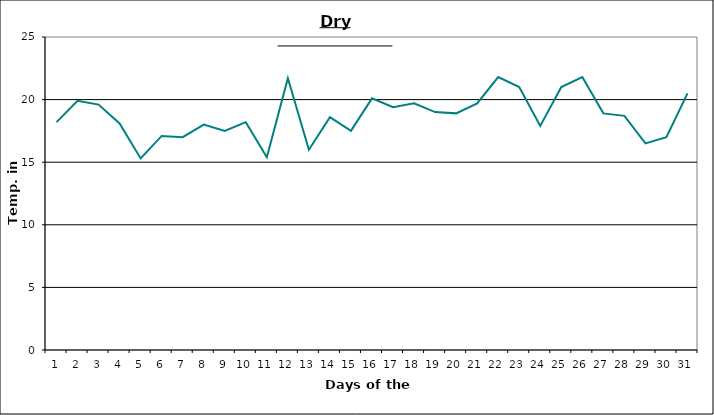
| Category | Series 0 |
|---|---|
| 0 | 18.2 |
| 1 | 19.9 |
| 2 | 19.6 |
| 3 | 18.1 |
| 4 | 15.3 |
| 5 | 17.1 |
| 6 | 17 |
| 7 | 18 |
| 8 | 17.5 |
| 9 | 18.2 |
| 10 | 15.4 |
| 11 | 21.7 |
| 12 | 16 |
| 13 | 18.6 |
| 14 | 17.5 |
| 15 | 20.1 |
| 16 | 19.4 |
| 17 | 19.7 |
| 18 | 19 |
| 19 | 18.9 |
| 20 | 19.7 |
| 21 | 21.8 |
| 22 | 21 |
| 23 | 17.9 |
| 24 | 21 |
| 25 | 21.8 |
| 26 | 18.9 |
| 27 | 18.7 |
| 28 | 16.5 |
| 29 | 17 |
| 30 | 20.5 |